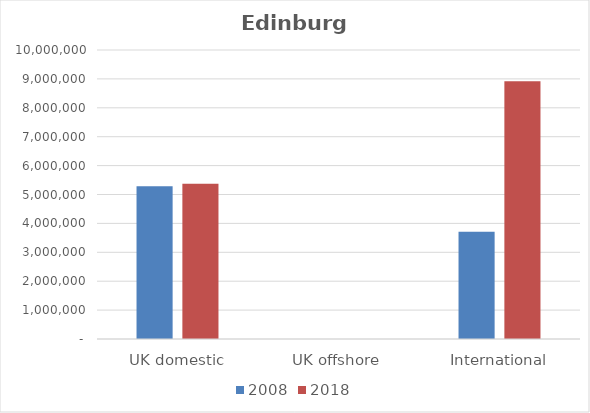
| Category | 2008 | 2018 |
|---|---|---|
| UK domestic | 5283385 | 5370564 |
| UK offshore | 0 | 0 |
| International | 3712860 | 8920738 |